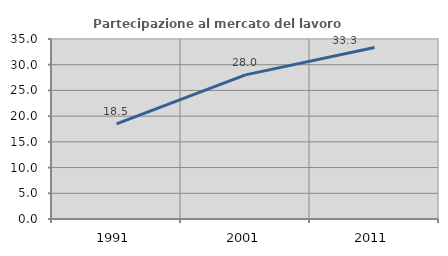
| Category | Partecipazione al mercato del lavoro  femminile |
|---|---|
| 1991.0 | 18.509 |
| 2001.0 | 28.022 |
| 2011.0 | 33.333 |